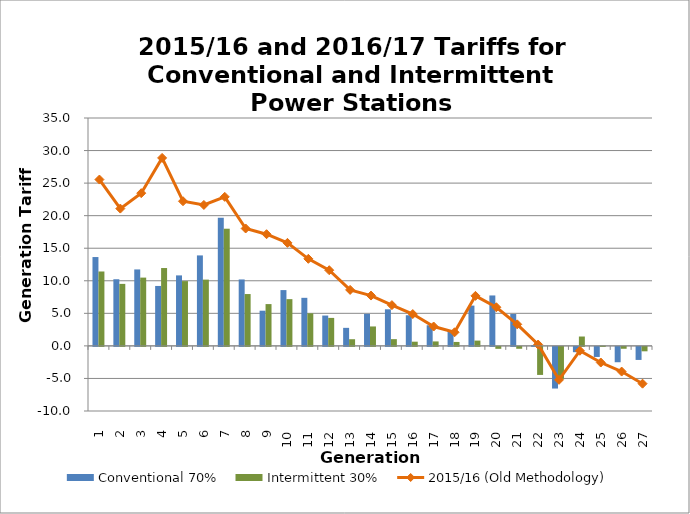
| Category | Conventional 70% | Intermittent 30% |
|---|---|---|
| 1.0 | 13.645 | 11.427 |
| 2.0 | 10.235 | 9.523 |
| 3.0 | 11.742 | 10.487 |
| 4.0 | 9.205 | 11.957 |
| 5.0 | 10.827 | 9.95 |
| 6.0 | 13.896 | 10.177 |
| 7.0 | 19.664 | 17.996 |
| 8.0 | 10.204 | 7.962 |
| 9.0 | 5.405 | 6.421 |
| 10.0 | 8.57 | 7.18 |
| 11.0 | 7.382 | 5.007 |
| 12.0 | 4.66 | 4.299 |
| 13.0 | 2.771 | 1.024 |
| 14.0 | 4.926 | 2.985 |
| 15.0 | 5.619 | 1.034 |
| 16.0 | 4.707 | 0.645 |
| 17.0 | 3.168 | 0.685 |
| 18.0 | 2.346 | 0.605 |
| 19.0 | 6.188 | 0.813 |
| 20.0 | 7.746 | -0.298 |
| 21.0 | 4.897 | -0.289 |
| 22.0 | 0.13 | -4.306 |
| 23.0 | -6.398 | -4.881 |
| 24.0 | -0.813 | 1.439 |
| 25.0 | -1.545 | 0.051 |
| 26.0 | -2.358 | -0.288 |
| 27.0 | -2.004 | -0.679 |